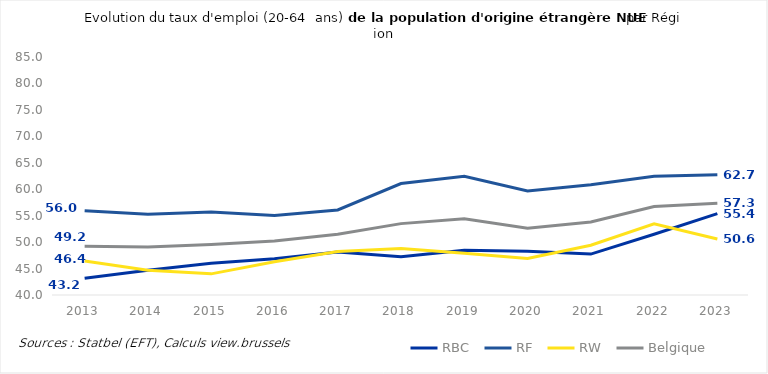
| Category | RBC | RF | RW | Belgique |
|---|---|---|---|---|
| 2013.0 | 43.161 | 55.952 | 46.436 | 49.201 |
| 2014.0 | 44.699 | 55.287 | 44.661 | 49.095 |
| 2015.0 | 46.019 | 55.706 | 43.998 | 49.564 |
| 2016.0 | 46.853 | 55.041 | 46.293 | 50.203 |
| 2017.0 | 48.13 | 56.081 | 48.227 | 51.481 |
| 2018.0 | 47.231 | 61.079 | 48.8 | 53.495 |
| 2019.0 | 48.441 | 62.443 | 47.903 | 54.4 |
| 2020.0 | 48.283 | 59.659 | 46.899 | 52.615 |
| 2021.0 | 47.734 | 60.838 | 49.401 | 53.793 |
| 2022.0 | 51.495 | 62.437 | 53.469 | 56.741 |
| 2023.0 | 55.374 | 62.738 | 50.59 | 57.348 |